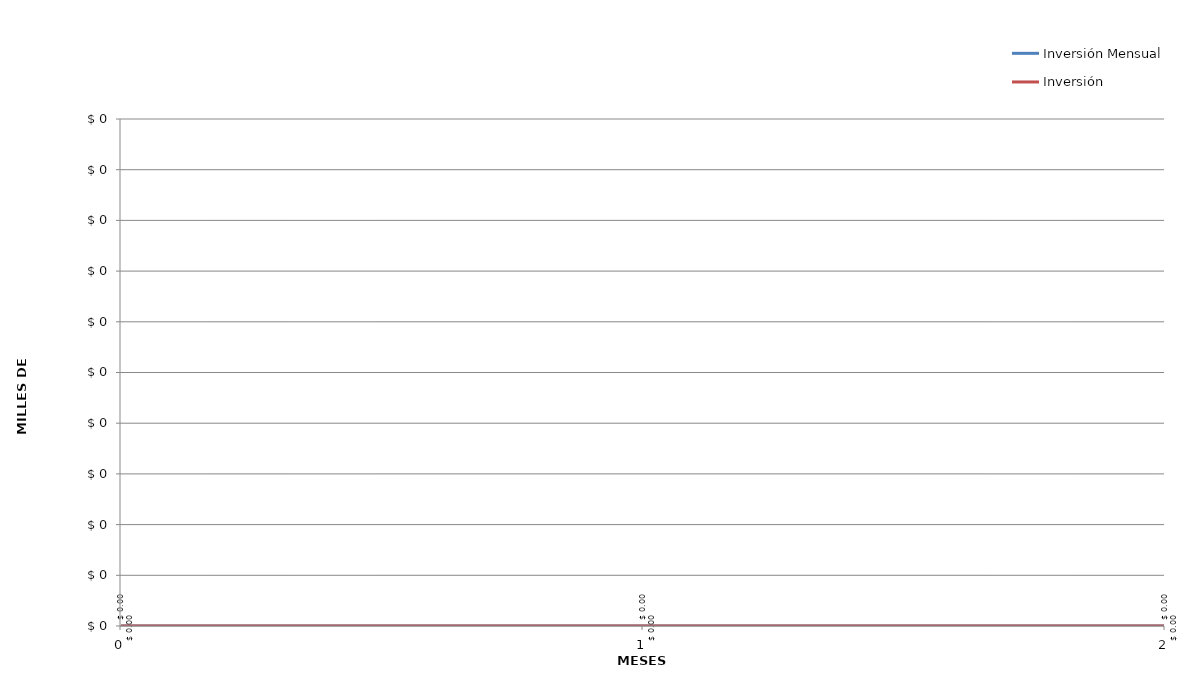
| Category | Inversión Mensual | Inversión Acumulada |
|---|---|---|
| 0.0 | 0 | 0 |
| 1.0 | 0 | 0 |
| 2.0 | 0 | 0 |